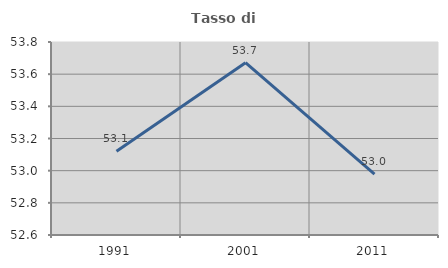
| Category | Tasso di occupazione   |
|---|---|
| 1991.0 | 53.12 |
| 2001.0 | 53.671 |
| 2011.0 | 52.978 |